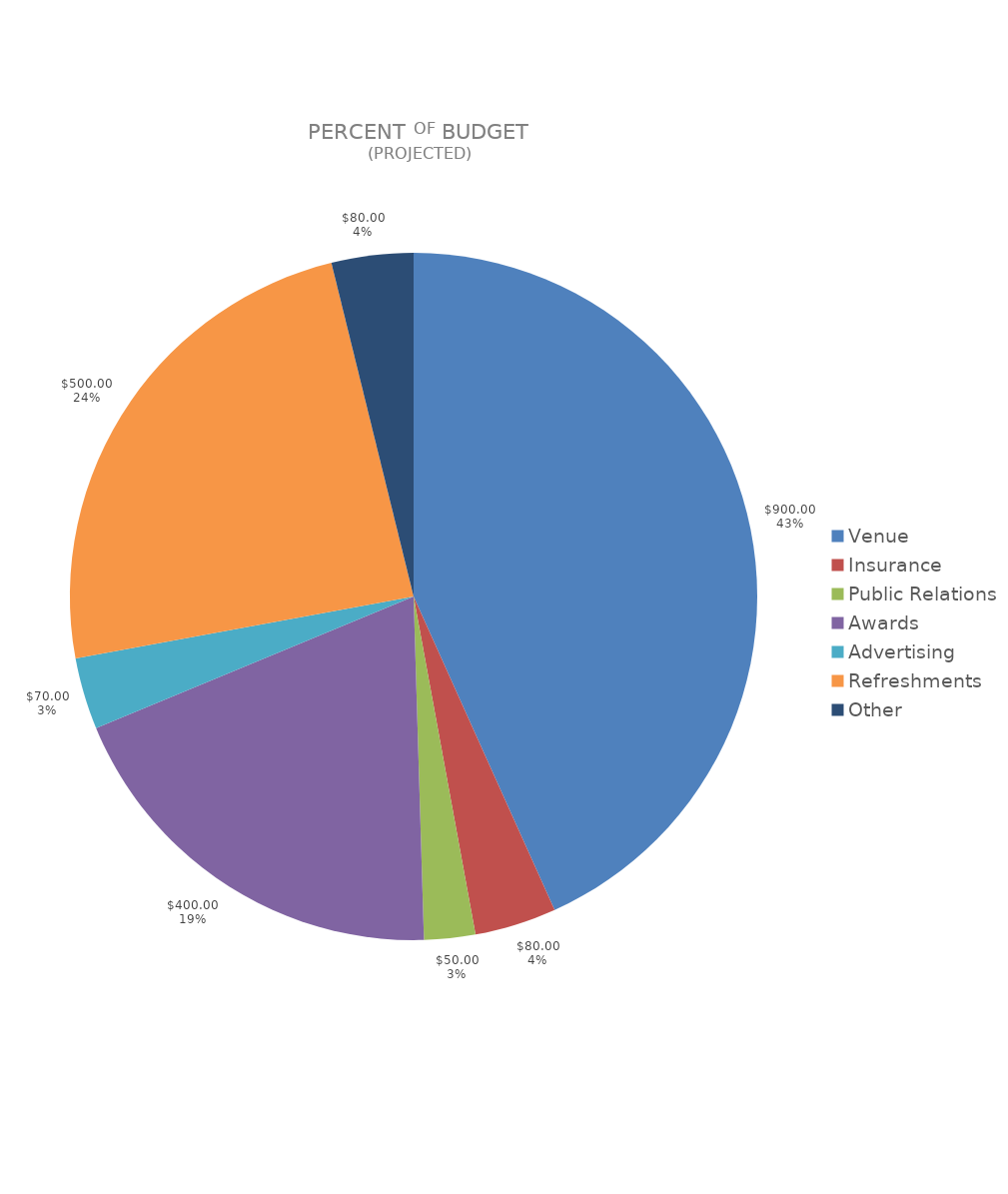
| Category | Series 0 | Series 1 |
|---|---|---|
| Venue | 900 | 0.433 |
| Insurance | 80 | 0.038 |
| Public Relations | 50 | 0.024 |
| Awards | 400 | 0.192 |
| Advertising | 70 | 0.034 |
| Refreshments | 500 | 0.24 |
| Other | 80 | 0.038 |